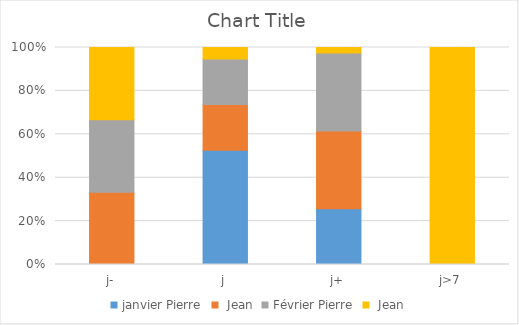
| Category | janvier | Février |
|---|---|---|
| j- | 10 | 10 |
| j | 20 | 5 |
| j+ | 70 | 5 |
| j>7 | 0 | 80 |